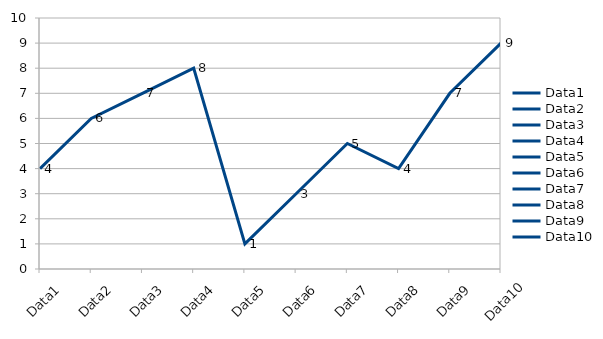
| Category | Series 0 |
|---|---|
| Data1 | 4 |
| Data2 | 6 |
| Data3 | 7 |
| Data4 | 8 |
| Data5 | 1 |
| Data6 | 3 |
| Data7 | 5 |
| Data8 | 4 |
| Data9 | 7 |
| Data10 | 9 |